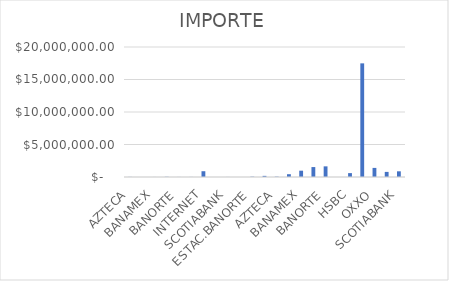
| Category | IMPORTE |
|---|---|
| AZTECA | 16145.47 |
| BAJIO | 4379.01 |
| BANAMEX | 5753.24 |
| BANCOMER | 31859.56 |
| BANORTE | 8305.63 |
| HSBC | 11528.51 |
| INTERNET | 889585.57 |
| SANTANDER | 2466.71 |
| SCOTIABANK | 8290.25 |
| OXXO | 1017 |
| ESTAC.BANORTE | 47757.5 |
| INTERNET | 173875.95 |
| AZTECA | 53829.94 |
| BAJIO | 430671.32 |
| BANAMEX | 970861.59 |
| BANCOMER | 1527813.79 |
| BANORTE | 1637191.8 |
| BANREGIO | 4214.4 |
| HSBC | 598213.54 |
| INTERNET | 17483275.82 |
| OXXO | 1399134.41 |
| SANTANDER | 785003.49 |
| SCOTIABANK | 874569.1 |